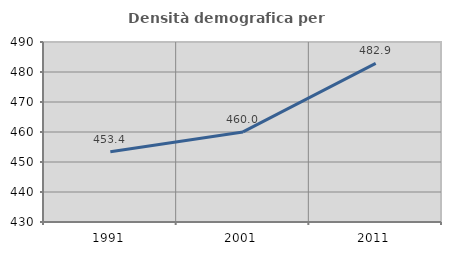
| Category | Densità demografica |
|---|---|
| 1991.0 | 453.406 |
| 2001.0 | 460.023 |
| 2011.0 | 482.894 |